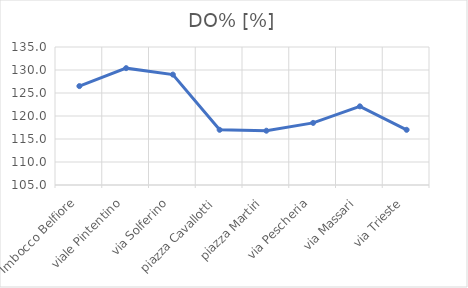
| Category | DO% [%] |
|---|---|
| Imbocco Belfiore | 126.5 |
| viale Pintentino | 130.4 |
| via Solferino | 129 |
| piazza Cavallotti | 117 |
| piazza Martiri | 116.8 |
| via Pescheria | 118.5 |
| via Massari | 122.1 |
| via Trieste | 117 |